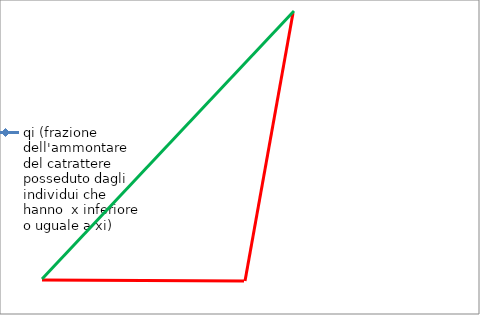
| Category | qi (frazione dell'ammontare del catrattere posseduto dagli individui che hanno  x inferiore o uguale a xi) |
|---|---|
| 0.0 | 0 |
| 0.2 | 0 |
| 0.4 | 0.017 |
| 0.6 | 0.067 |
| 0.8 | 0.367 |
| 1.0 | 1 |